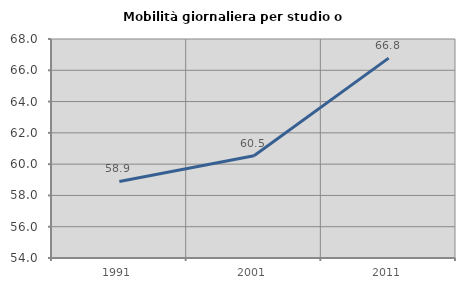
| Category | Mobilità giornaliera per studio o lavoro |
|---|---|
| 1991.0 | 58.895 |
| 2001.0 | 60.535 |
| 2011.0 | 66.777 |